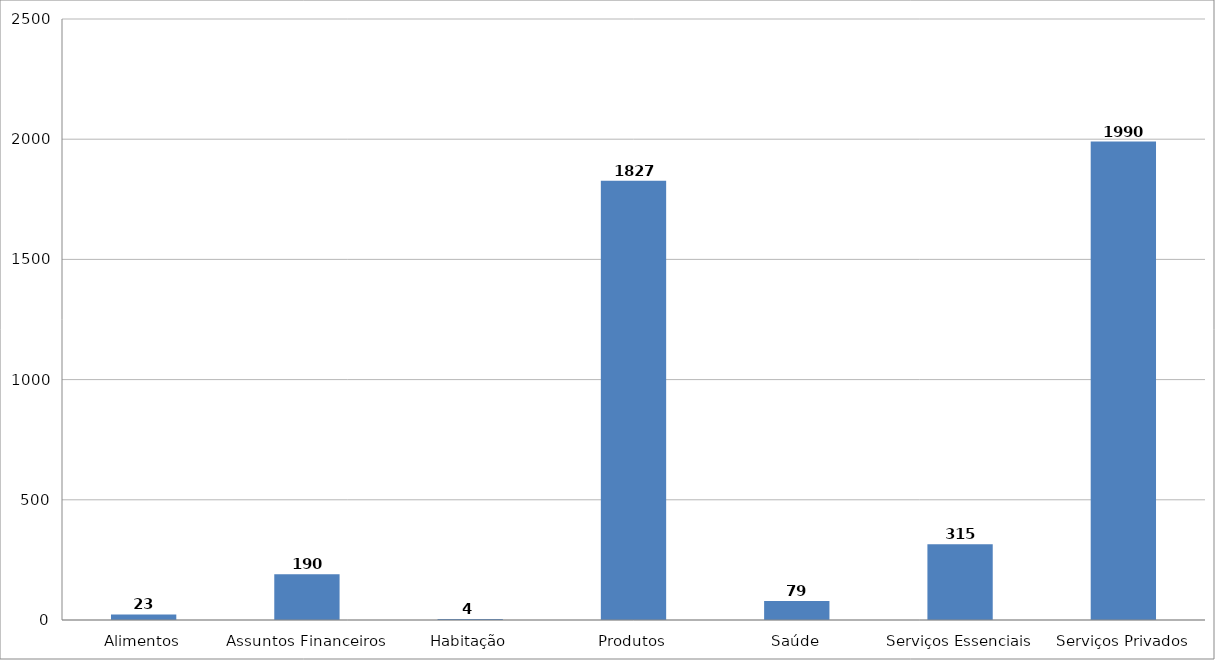
| Category | Series 0 |
|---|---|
| Alimentos | 23 |
| Assuntos Financeiros | 190 |
| Habitação | 4 |
| Produtos | 1827 |
| Saúde | 79 |
| Serviços Essenciais | 315 |
| Serviços Privados | 1990 |